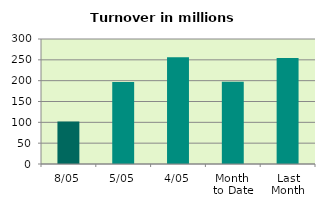
| Category | Series 0 |
|---|---|
| 8/05 | 102.198 |
| 5/05 | 196.834 |
| 4/05 | 256.058 |
| Month 
to Date | 197.316 |
| Last
Month | 254.458 |